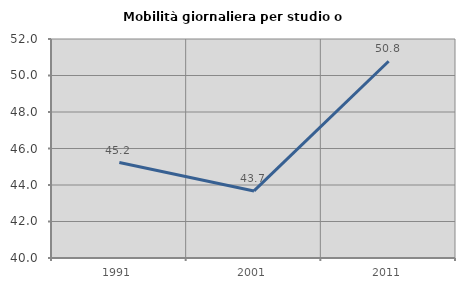
| Category | Mobilità giornaliera per studio o lavoro |
|---|---|
| 1991.0 | 45.229 |
| 2001.0 | 43.675 |
| 2011.0 | 50.779 |